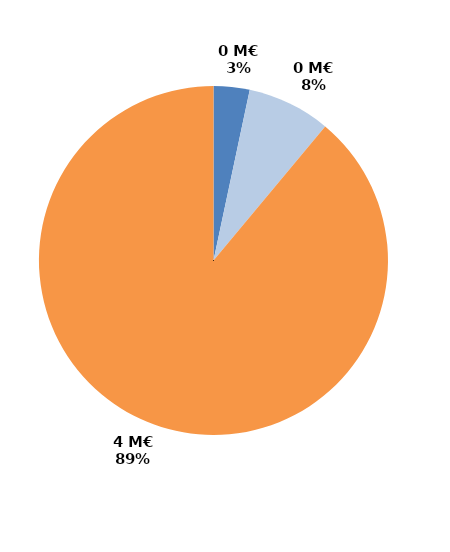
| Category | Series 0 |
|---|---|
| CIF - CPF | 0.133 |
| Période de professionnalisation | 0.308 |
| Plan de formation | 3.543 |
| Autres | 0 |